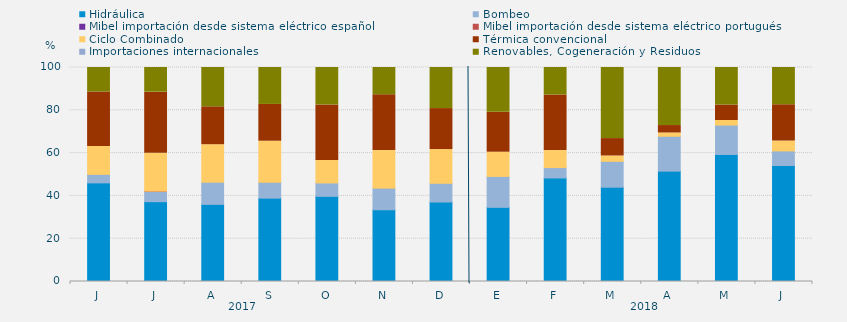
| Category | Hidráulica | Bombeo | Mibel importación desde sistema eléctrico español | Mibel importación desde sistema eléctrico portugués | Ciclo Combinado | Térmica convencional | Importaciones internacionales | Renovables, Cogeneración y Residuos |
|---|---|---|---|---|---|---|---|---|
| J | 46.088 | 3.981 | 0 | 0 | 13.032 | 25.463 | 0 | 11.435 |
| J | 37.298 | 4.783 | 0 | 0.134 | 17.675 | 28.595 | 0 | 11.514 |
| A | 36.044 | 10.361 | 0 | 0 | 17.518 | 17.708 | 0 | 18.369 |
| S | 38.947 | 7.407 | 0 | 0 | 19.201 | 17.187 | 0 | 17.257 |
| O | 39.807 | 6.25 | 0 | 0 | 10.484 | 25.963 | 0 | 17.496 |
| N | 33.519 | 10.116 | 0 | 0 | 17.546 | 26.088 | 0 | 12.731 |
| D | 37.142 | 8.737 | 0 | 0 | 15.771 | 19.153 | 0 | 19.198 |
| E | 34.655 | 14.449 | 0 | 0 | 11.313 | 18.638 | 0 | 20.945 |
| F | 48.388 | 4.836 | 0 | 0 | 7.961 | 25.992 | 0 | 12.822 |
| M | 44.056 | 12.113 | 0 | 0 | 2.49 | 8.12 | 0 | 33.221 |
| A | 51.574 | 16.296 | 0 | 0 | 1.528 | 3.472 | 0 | 27.13 |
| M | 59.364 | 13.732 | 0 | 0 | 2.128 | 7.236 | 0 | 17.54 |
| J | 54.213 | 6.806 | 0 | 0 | 4.63 | 16.944 | 0 | 17.407 |